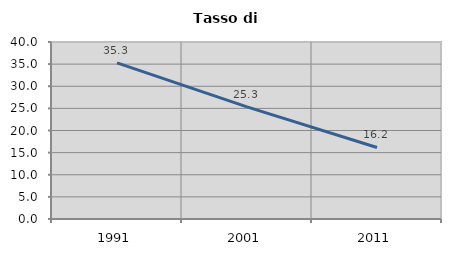
| Category | Tasso di disoccupazione   |
|---|---|
| 1991.0 | 35.29 |
| 2001.0 | 25.332 |
| 2011.0 | 16.163 |